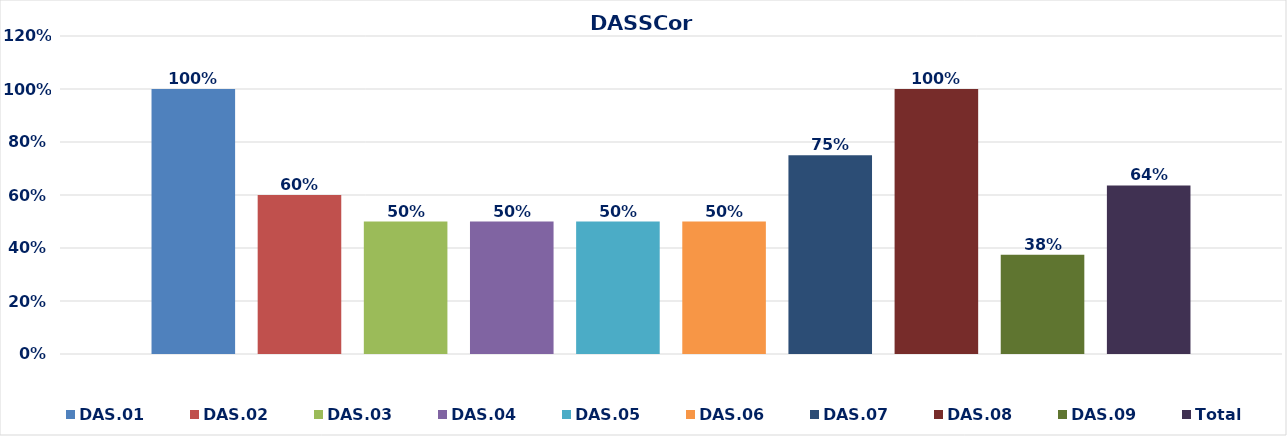
| Category | DAS.01 | DAS.02 | DAS.03 | DAS.04 | DAS.05 | DAS.06 | DAS.07 | DAS.08 | DAS.09 | Total |
|---|---|---|---|---|---|---|---|---|---|---|
| 0 | 1 | 0.6 | 0.5 | 0.5 | 0.5 | 0.5 | 0.75 | 1 | 0.375 | 0.636 |